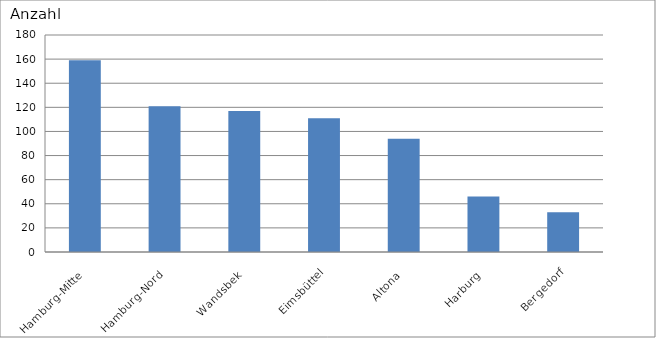
| Category | Hamburg-Mitte |
|---|---|
| Hamburg-Mitte | 159 |
| Hamburg-Nord | 121 |
| Wandsbek | 117 |
| Eimsbüttel | 111 |
| Altona | 94 |
| Harburg | 46 |
| Bergedorf | 33 |